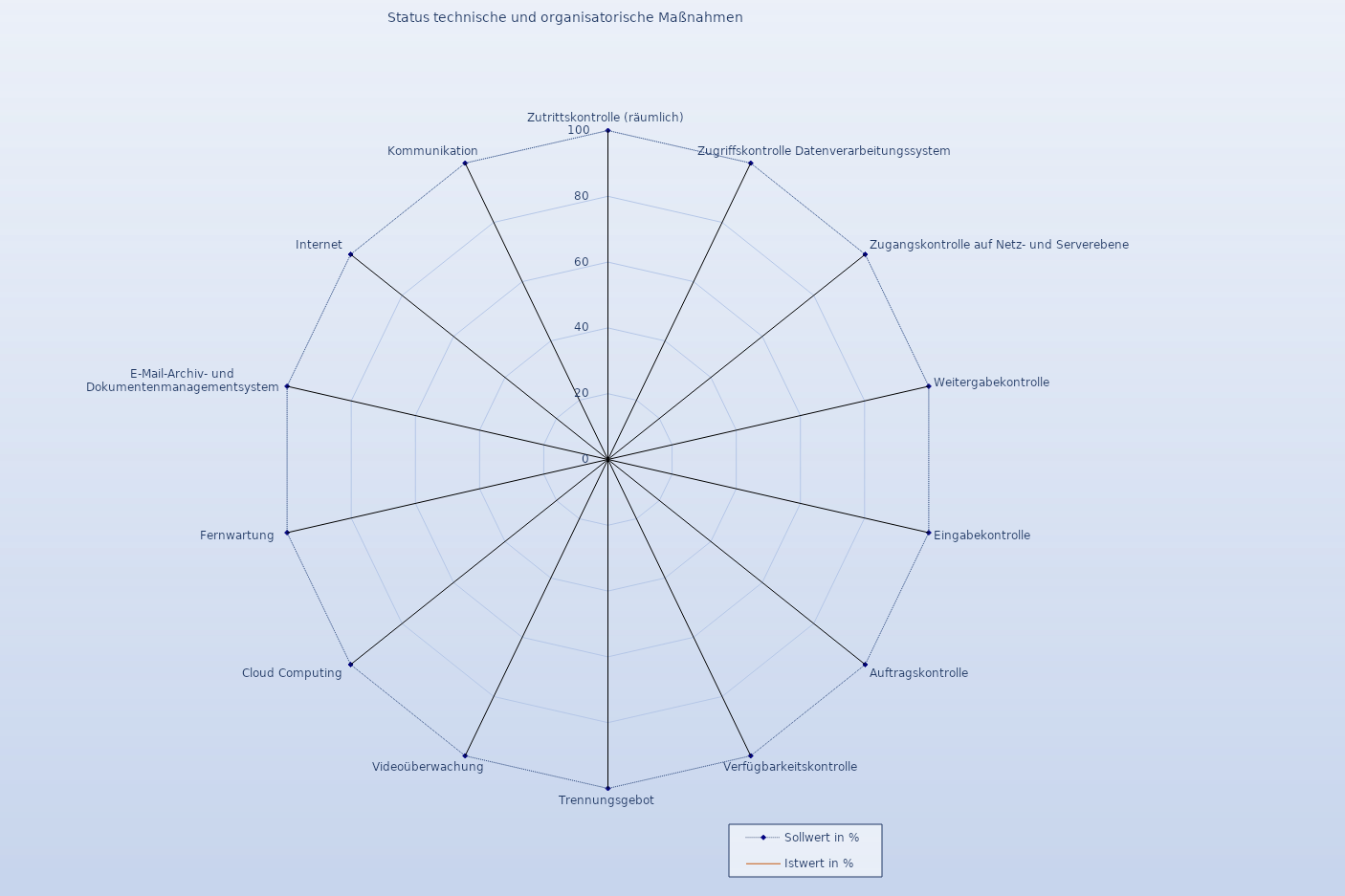
| Category | Sollwert in % | Istwert in % |
|---|---|---|
| Zutrittskontrolle (räumlich) | 100 | 0 |
| Zugriffskontrolle Datenverarbeitungssystem | 100 | 0 |
| Zugangskontrolle auf Netz- und Serverebene | 100 | 0 |
| Weitergabekontrolle | 100 | 0 |
| Eingabekontrolle | 100 | 0 |
| Auftragskontrolle | 100 | 0 |
| Verfügbarkeitskontrolle | 100 | 0 |
| Trennungsgebot | 100 | 0 |
| Videoüberwachung | 100 | 0 |
| Cloud Computing | 100 | 0 |
| Fernwartung  | 100 | 0 |
| E-Mail-Archiv- und Dokumentenmanagementsystem | 100 | 0 |
| Internet | 100 | 0 |
| Kommunikation | 100 | 0 |